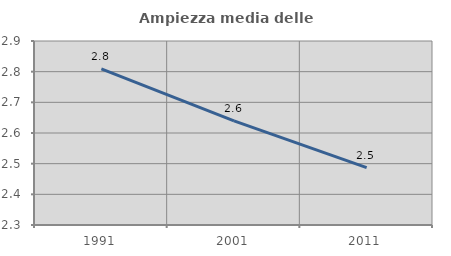
| Category | Ampiezza media delle famiglie |
|---|---|
| 1991.0 | 2.809 |
| 2001.0 | 2.64 |
| 2011.0 | 2.487 |